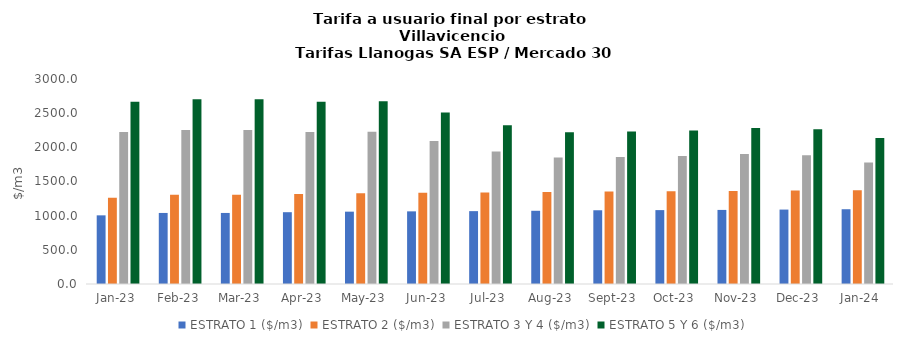
| Category | ESTRATO 1 ($/m3) | ESTRATO 2 ($/m3) | ESTRATO 3 Y 4 ($/m3) | ESTRATO 5 Y 6 ($/m3) |
|---|---|---|---|---|
| 2023-01-01 | 1004.76 | 1260.83 | 2223.64 | 2668.368 |
| 2023-02-01 | 1039.76 | 1304.76 | 2251.92 | 2702.304 |
| 2023-03-01 | 1039.76 | 1304.76 | 2251.92 | 2702.304 |
| 2023-04-01 | 1050.8 | 1318.62 | 2223.64 | 2668.368 |
| 2023-05-01 | 1058.67 | 1328.49 | 2227.49 | 2672.988 |
| 2023-06-01 | 1063.04 | 1333.97 | 2092.35 | 2510.82 |
| 2023-07-01 | 1066.3 | 1338.06 | 1937.39 | 2324.868 |
| 2023-08-01 | 1071.54 | 1344.64 | 1852.08 | 2222.496 |
| 2023-09-01 | 1079.09 | 1354.11 | 1858.9 | 2230.68 |
| 2023-10-01 | 1081.39 | 1357 | 1871.96 | 2246.352 |
| 2023-11-01 | 1084.09 | 1360.39 | 1903.33 | 2283.996 |
| 2023-12-01 | 1089.17 | 1366.77 | 1885.93 | 2263.116 |
| 2024-01-01 | 1094.18 | 1373.05 | 1779.87 | 2135.844 |